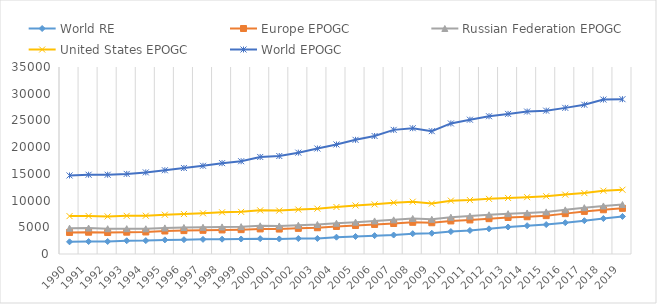
| Category | World RE | Europe EPOGC | Russian Federation EPOGC | United States EPOGC | World EPOGC |
|---|---|---|---|---|---|
| 1990 | 2279.887 | 1754.707 | 796.964 | 2261.957 | 7610.061 |
| 1991 | 2335.985 | 1740.858 | 780.02 | 2261.573 | 7718.215 |
| 1992 | 2345.218 | 1674.211 | 714.351 | 2299.683 | 7801.105 |
| 1993 | 2482.781 | 1599.977 | 660.445 | 2398.646 | 7849.325 |
| 1994 | 2505.014 | 1617.947 | 599.497 | 2441.003 | 8111.545 |
| 1995 | 2640.898 | 1661.804 | 581.632 | 2466.568 | 8326.35 |
| 1996 | 2680.974 | 1698.168 | 581.25 | 2522.6 | 8614.956 |
| 1997 | 2740.197 | 1693.84 | 565.682 | 2613.247 | 8898.352 |
| 1998 | 2772.457 | 1733.78 | 562.42 | 2738.78 | 9196.593 |
| 1999 | 2805.202 | 1756.56 | 560.877 | 2763.086 | 9480.719 |
| 2000 | 2870.558 | 1823.481 | 579.078 | 2895.138 | 9992.856 |
| 2001 | 2815.563 | 1854.406 | 575.537 | 2878.5 | 10215.715 |
| 2002 | 2892.303 | 1907.131 | 582.546 | 2935.663 | 10650.761 |
| 2003 | 2910.704 | 2005.074 | 606.175 | 2966.29 | 11255.713 |
| 2004 | 3144.12 | 2006.185 | 607.333 | 3037.417 | 11706.227 |
| 2005 | 3279.19 | 2050.184 | 627.056 | 3128.519 | 12281.718 |
| 2006 | 3437.948 | 2094.339 | 657.258 | 3102.468 | 12792.233 |
| 2007 | 3552.62 | 2158.816 | 677.18 | 3217.46 | 13626.011 |
| 2008 | 3806.185 | 2127.261 | 707.175 | 3147.023 | 13758.365 |
| 2009 | 3889.169 | 1960.363 | 650.268 | 2931.668 | 13560.752 |
| 2010 | 4195.931 | 1994.762 | 695.941 | 3100.389 | 14449.101 |
| 2011 | 4405.544 | 1971.85 | 713.78 | 2998.782 | 15044.962 |
| 2012 | 4712.145 | 1901.006 | 723.375 | 2983.897 | 15467.297 |
| 2013 | 5052.918 | 1786.569 | 700.538 | 2952.653 | 15730.278 |
| 2014 | 5299.417 | 1674.165 | 704.281 | 2957.605 | 16024.698 |
| 2015 | 5511.303 | 1669.604 | 698.408 | 2932.522 | 16017.573 |
| 2016 | 5852.825 | 1703.499 | 704.228 | 2854.266 | 16235.59 |
| 2017 | 6236.681 | 1738.233 | 697.234 | 2726.999 | 16539.466 |
| 2018 | 6639.362 | 1642.608 | 708.206 | 2853.094 | 17064.132 |
| 2019 | 7027.733 | 1518.523 | 708.655 | 2774.37 | 16947.33 |